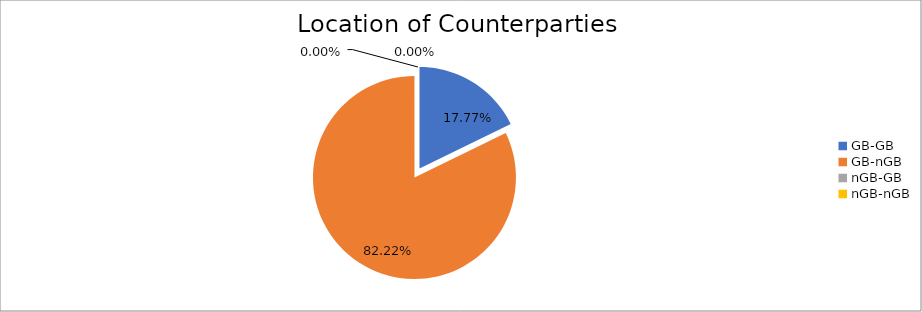
| Category | Series 0 |
|---|---|
| GB-GB | 1010278.122 |
| GB-nGB | 4673649.742 |
| nGB-GB | 83.071 |
| nGB-nGB | 238.111 |